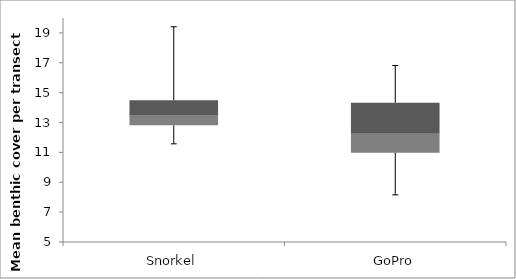
| Category | Min | Q1-Min | Med-Q1 | Q3-Med |
|---|---|---|---|---|
| Snorkel | 11.574 | 1.238 | 0.685 | 0.993 |
| GoPro | 8.156 | 2.823 | 1.266 | 2.089 |